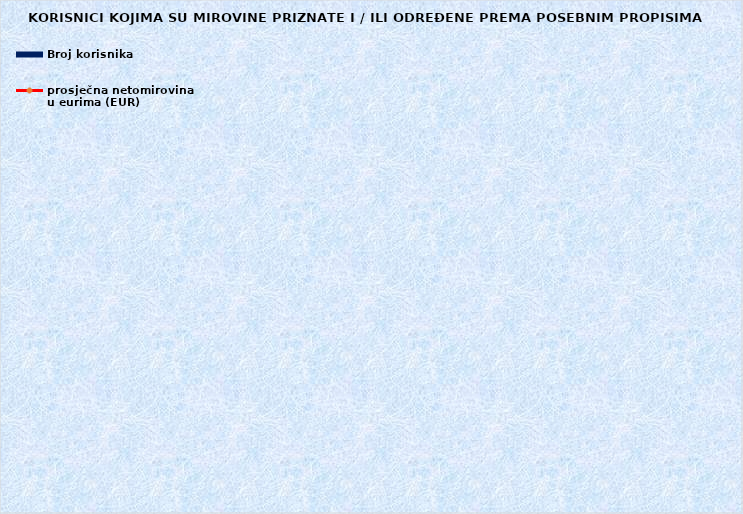
| Category | Broj korisnika |
|---|---|
|      a) radnici na poslovima ovlaštenih službenih osoba u tijelima unutarnjih 
poslova i pravosuđa, kojima je pravo na mirovinu priznato prema propisima
koji su bili na snazi do stupanja na snagu Zakona o pravima iz mirovinskog
osiguranja DVO, PS i OSO | 7119 |
|      b) radnici na  poslovima policijskih službenika, ovlaštenih službenih osoba pravosuđa i službene osobe s posebnim dužnostima i ovlastima u sigurnosno obavještajnom sustavu RH koji su pravo na mirovinu ostvarili prema Zakonu o pravima DVO, PS i OSO | 9420 |
|      c) radnici na poslovima razminiranja | 661 |
| Korisnici koji pravo na mirovinu ostvaruju prema Zakonu o vatrogastvu (NN 125/19)* | 339 |
| Djelatne vojne osobe - DVO  | 16022 |
| Pripadnici Hrvatske domovinske vojske od 1941. do 1945. godine | 1975 |
| Bivši politički zatvorenici | 2105 |
| Hrvatski branitelji iz Domovinskog rata - ZOHBDR | 71276 |
| Mirovine priznate prema općim propisima, a određene prema
ZOHBDR - u iz 2017. (čl. 27., 35., 48. i 49. stavak 2.)  | 56941 |
| Pripadnici bivše Jugoslavenske narodne armije - JNA | 3737 |
| Pripadnici bivše Jugoslavenske narodne armije - JNA - čl. 185 ZOMO | 158 |
| Sudionici Narodnooslobodilačkog rata - NOR | 5112 |
| Zastupnici u Hrvatskom saboru, članovi Vlade, suci Ustavnog suda i glavni državni revizor  | 682 |
| Članovi Izvršnog vijeća Sabora, Saveznog izvršnog vijeća i administrativno umirovljeni javni službenici | 67 |
| Bivši službenici u saveznim tijelima bivše SFRJ - članak 38. ZOMO | 18 |
| Redoviti članovi Hrvatske akademije znanosti i umjetnosti - HAZU | 127 |
| Radnici u Istarskim ugljenokopima "Tupljak" d.d. Labin  | 246 |
| Radnici profesionalno izloženi azbestu | 821 |
| Osiguranici - članovi posade broda u međunarodnoj plovidbi i nacionalnoj plovidbi - članak 129. a stavak 2. Pomorskog zakonika | 202 |
| Pripadnici Hrvatskog vijeća obrane  - HVO  | 6734 |